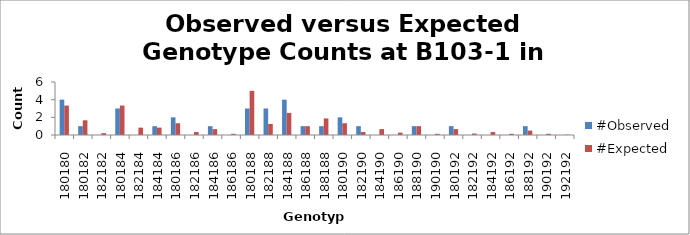
| Category | #Observed | #Expected |
|---|---|---|
| 180180.0 | 4 | 3.333 |
| 180182.0 | 1 | 1.667 |
| 182182.0 | 0 | 0.208 |
| 180184.0 | 3 | 3.333 |
| 182184.0 | 0 | 0.833 |
| 184184.0 | 1 | 0.833 |
| 180186.0 | 2 | 1.333 |
| 182186.0 | 0 | 0.333 |
| 184186.0 | 1 | 0.667 |
| 186186.0 | 0 | 0.133 |
| 180188.0 | 3 | 5 |
| 182188.0 | 3 | 1.25 |
| 184188.0 | 4 | 2.5 |
| 186188.0 | 1 | 1 |
| 188188.0 | 1 | 1.875 |
| 180190.0 | 2 | 1.333 |
| 182190.0 | 1 | 0.333 |
| 184190.0 | 0 | 0.667 |
| 186190.0 | 0 | 0.267 |
| 188190.0 | 1 | 1 |
| 190190.0 | 0 | 0.133 |
| 180192.0 | 1 | 0.667 |
| 182192.0 | 0 | 0.167 |
| 184192.0 | 0 | 0.333 |
| 186192.0 | 0 | 0.133 |
| 188192.0 | 1 | 0.5 |
| 190192.0 | 0 | 0.133 |
| 192192.0 | 0 | 0.033 |